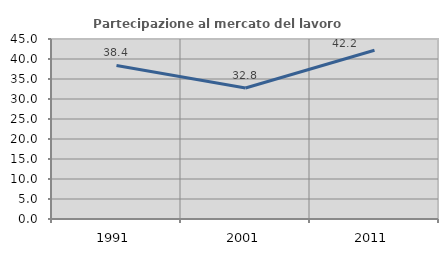
| Category | Partecipazione al mercato del lavoro  femminile |
|---|---|
| 1991.0 | 38.4 |
| 2001.0 | 32.759 |
| 2011.0 | 42.188 |